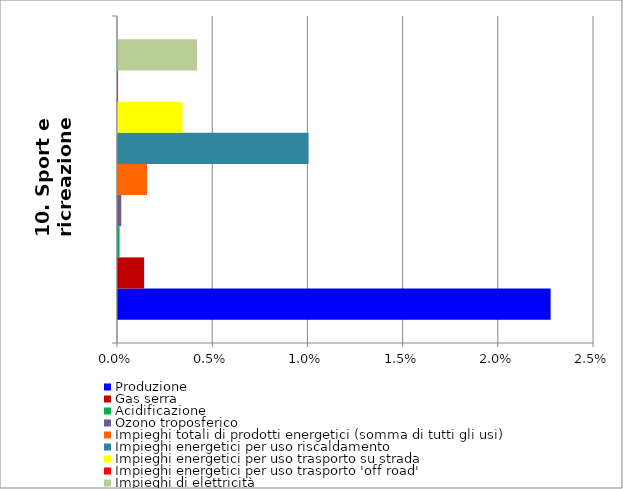
| Category | Produzione | Gas serra | Acidificazione | Ozono troposferico | Impieghi totali di prodotti energetici (somma di tutti gli usi) | Impieghi energetici per uso riscaldamento | Impieghi energetici per uso trasporto su strada | Impieghi energetici per uso trasporto 'off road' | Impieghi di elettricità |
|---|---|---|---|---|---|---|---|---|---|
| 10. Sport e ricreazione | 0.023 | 0.001 | 0 | 0 | 0.002 | 0.01 | 0.003 | 0 | 0.004 |